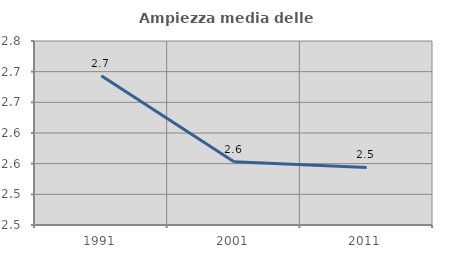
| Category | Ampiezza media delle famiglie |
|---|---|
| 1991.0 | 2.693 |
| 2001.0 | 2.553 |
| 2011.0 | 2.544 |